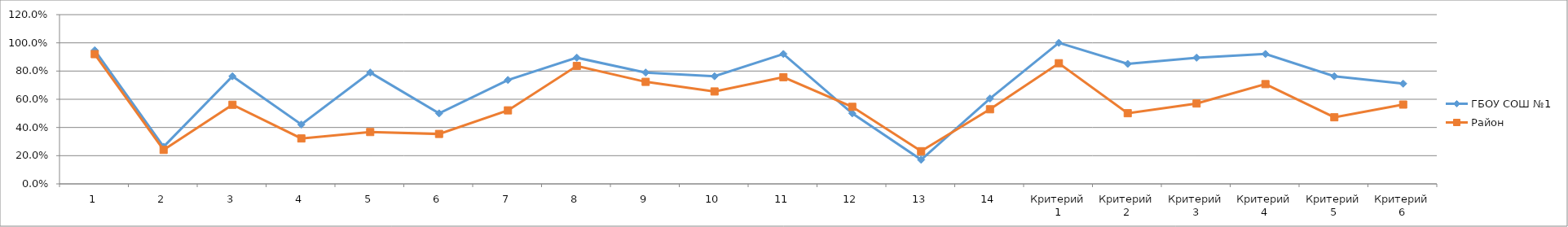
| Category | ГБОУ СОШ №1 | Район |
|---|---|---|
| 1 | 0.947 | 0.92 |
| 2 | 0.263 | 0.241 |
| 3 | 0.763 | 0.561 |
| 4 | 0.421 | 0.322 |
| 5 | 0.789 | 0.368 |
| 6 | 0.5 | 0.354 |
| 7 | 0.737 | 0.521 |
| 8 | 0.895 | 0.836 |
| 9 | 0.789 | 0.723 |
| 10 | 0.763 | 0.655 |
| 11 | 0.921 | 0.756 |
| 12 | 0.5 | 0.546 |
| 13 | 0.171 | 0.232 |
| 14 | 0.605 | 0.529 |
| Критерий 1 | 1 | 0.855 |
| Критерий 2 | 0.851 | 0.501 |
| Критерий 3 | 0.895 | 0.57 |
| Критерий 4 | 0.921 | 0.707 |
| Критерий 5 | 0.763 | 0.472 |
| Критерий 6 | 0.711 | 0.562 |